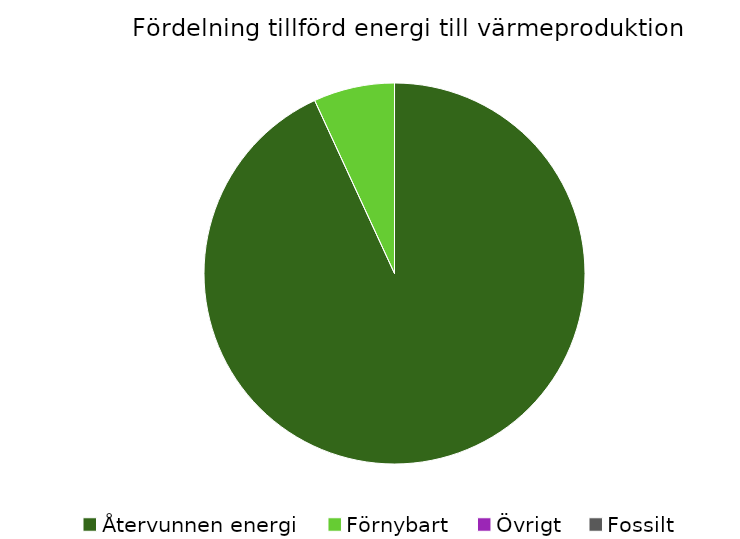
| Category | Fördelning värmeproduktion |
|---|---|
| Återvunnen energi | 0.931 |
| Förnybart | 0.069 |
| Övrigt | 0 |
| Fossilt | 0 |